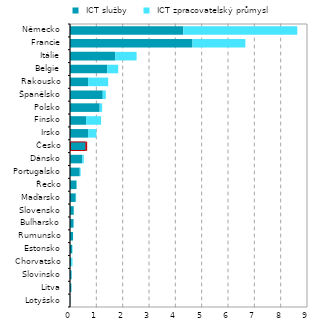
| Category |  ICT služby |  ICT zpracovatelský průmysl |
|---|---|---|
| Lotyšsko | 0.01 | 0.001 |
| Litva | 0.051 | 0.007 |
| Slovinsko | 0.058 | 0.014 |
| Chorvatsko | 0.041 | 0.055 |
| Estonsko | 0.082 | 0.015 |
| Rumunsko | 0.114 | 0.002 |
| Bulharsko | 0.135 | 0.007 |
| Slovensko | 0.142 | 0.003 |
| Maďarsko | 0.217 | 0.016 |
| Řecko | 0.249 | 0.008 |
| Portugalsko | 0.37 | 0.034 |
| Dánsko | 0.464 | 0.061 |
| Česko | 0.595 | 0.038 |
| Irsko | 0.687 | 0.317 |
| Finsko | 0.612 | 0.568 |
| Polsko | 1.128 | 0.092 |
| Španělsko | 1.243 | 0.116 |
| Rakousko | 0.687 | 0.763 |
| Belgie | 1.412 | 0.418 |
| Itálie | 1.715 | 0.814 |
| Francie | 4.65 | 2.01 |
| Německo | 4.302 | 4.328 |